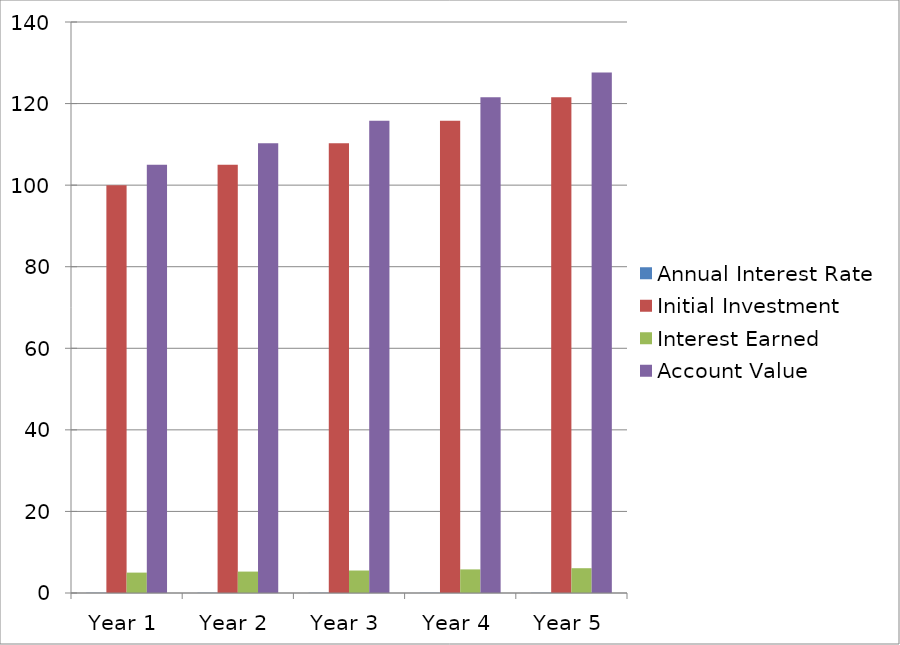
| Category | Annual Interest Rate | Initial Investment | Interest Earned | Account Value |
|---|---|---|---|---|
| Year 1 | 0.05 | 100 | 5 | 105 |
| Year 2 | 0.05 | 105 | 5.25 | 110.25 |
| Year 3 | 0.05 | 110.25 | 5.512 | 115.762 |
| Year 4 | 0.05 | 115.762 | 5.788 | 121.551 |
| Year 5 | 0.05 | 121.551 | 6.078 | 127.628 |